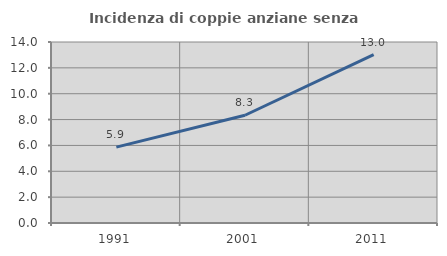
| Category | Incidenza di coppie anziane senza figli  |
|---|---|
| 1991.0 | 5.867 |
| 2001.0 | 8.333 |
| 2011.0 | 13.019 |